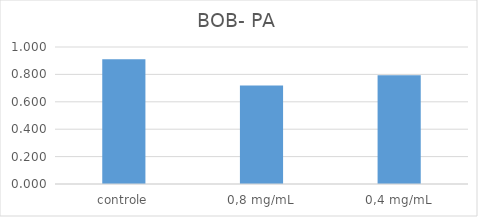
| Category | Series 0 |
|---|---|
| controle | 0.91 |
| 0,8 mg/mL | 0.72 |
| 0,4 mg/mL | 0.794 |